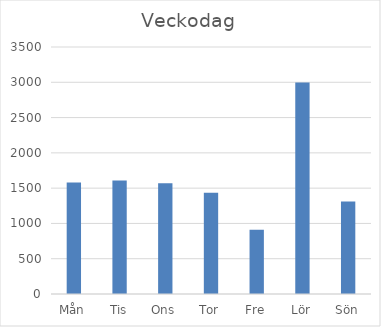
| Category | Summa |
|---|---|
| Mån | 1580 |
| Tis | 1609 |
| Ons | 1568 |
| Tor | 1435 |
| Fre | 912 |
| Lör | 2996 |
| Sön | 1311 |